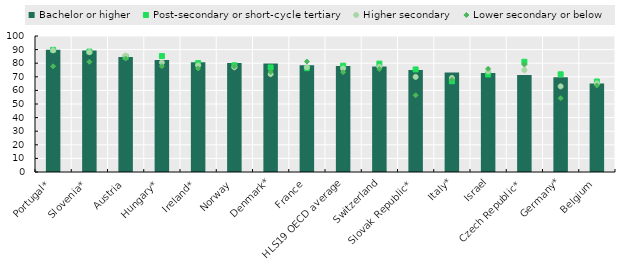
| Category | Bachelor or higher |
|---|---|
| Portugal* | 89.96 |
| Slovenia* | 89.27 |
| Austria | 84.59 |
| Hungary* | 82.32 |
| Ireland* | 80.74 |
| Norway | 80.09 |
| Denmark* | 79.76 |
| France | 78.52 |
| HLS19 OECD average | 77.973 |
| Switzerland | 77.66 |
| Slovak Republic* | 74.95 |
| Italy* | 73.07 |
| Israel | 72.71 |
| Czech Republic* | 71.3 |
| Germany* | 69.66 |
| Belgium | 65 |